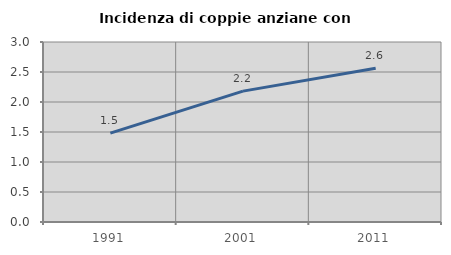
| Category | Incidenza di coppie anziane con figli |
|---|---|
| 1991.0 | 1.481 |
| 2001.0 | 2.181 |
| 2011.0 | 2.561 |